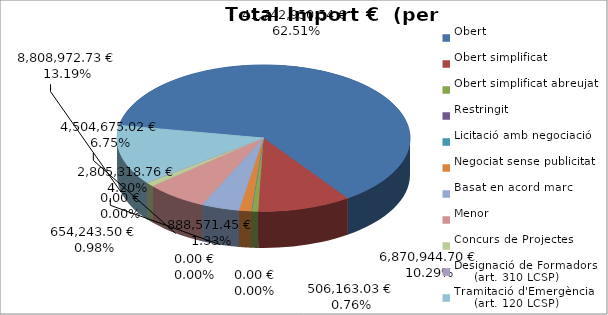
| Category | Total preu
(amb IVA) |
|---|---|
| Obert | 41742950.538 |
| Obert simplificat | 6870944.695 |
| Obert simplificat abreujat | 506163.028 |
| Restringit | 0 |
| Licitació amb negociació | 0 |
| Negociat sense publicitat | 888571.451 |
| Basat en acord marc | 2805318.756 |
| Menor | 4504675.016 |
| Concurs de Projectes | 654243.503 |
| Designació de Formadors
     (art. 310 LCSP) | 0 |
| Tramitació d'Emergència
     (art. 120 LCSP) | 8808972.727 |